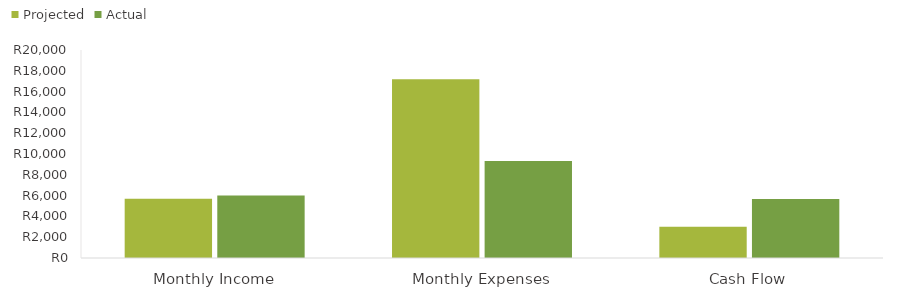
| Category | Projected | Actual |
|---|---|---|
| Monthly Income | 5700 | 6000 |
| Monthly Expenses | 17191 | 9338 |
| Cash Flow | 3000 | 5662 |